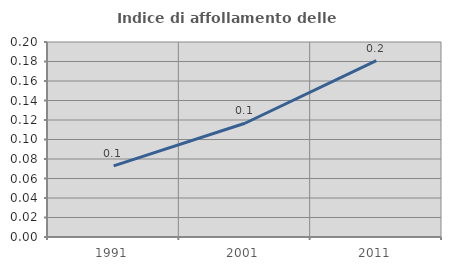
| Category | Indice di affollamento delle abitazioni  |
|---|---|
| 1991.0 | 0.073 |
| 2001.0 | 0.117 |
| 2011.0 | 0.181 |